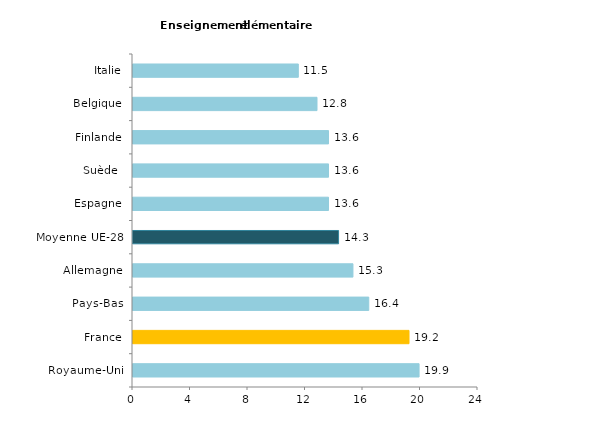
| Category | Series 0 |
|---|---|
| Royaume-Uni | 19.9 |
| France | 19.2 |
| Pays-Bas | 16.4 |
| Allemagne | 15.3 |
| Moyenne UE-28 | 14.3 |
| Espagne | 13.6 |
| Suède  | 13.6 |
| Finlande | 13.6 |
| Belgique | 12.8 |
| Italie | 11.5 |